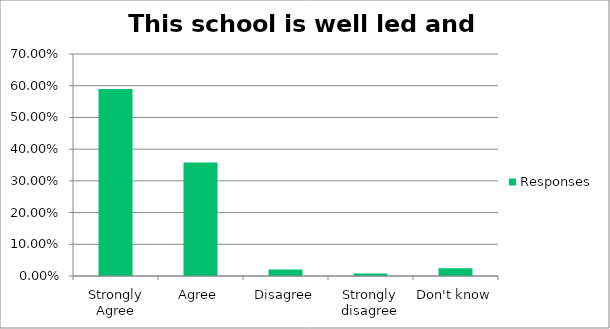
| Category | Responses |
|---|---|
| Strongly Agree | 0.589 |
| Agree | 0.358 |
| Disagree | 0.02 |
| Strongly disagree | 0.008 |
| Don't know | 0.024 |